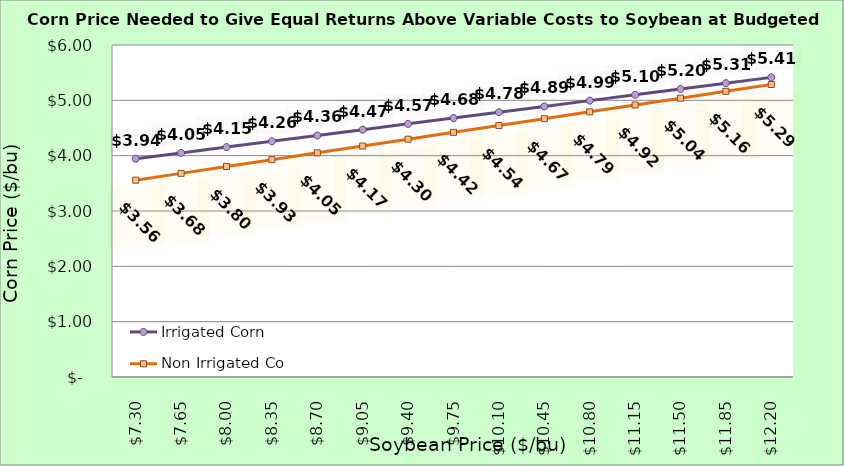
| Category | Irrigated Corn | Non Irrigated Corn |
|---|---|---|
| 7.3000000000000025 | 3.945 | 3.557 |
| 7.650000000000002 | 4.05 | 3.68 |
| 8.000000000000002 | 4.155 | 3.804 |
| 8.350000000000001 | 4.26 | 3.927 |
| 8.700000000000001 | 4.365 | 4.051 |
| 9.05 | 4.47 | 4.174 |
| 9.4 | 4.575 | 4.298 |
| 9.75 | 4.68 | 4.421 |
| 10.1 | 4.785 | 4.545 |
| 10.45 | 4.89 | 4.668 |
| 10.799999999999999 | 4.995 | 4.792 |
| 11.149999999999999 | 5.1 | 4.916 |
| 11.499999999999998 | 5.205 | 5.039 |
| 11.849999999999998 | 5.31 | 5.163 |
| 12.199999999999998 | 5.415 | 5.286 |